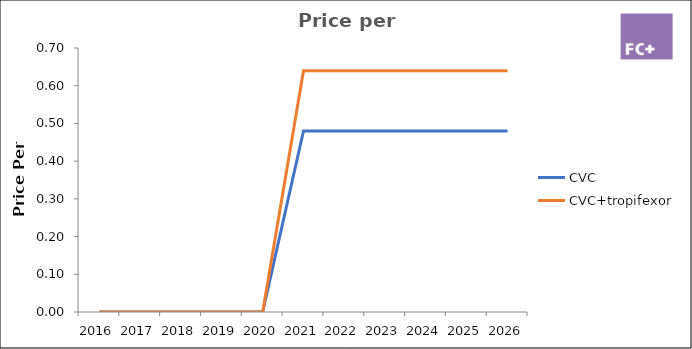
| Category | CVC | CVC+tropifexor |
|---|---|---|
| 2016.0 | 0 | 0 |
| 2017.0 | 0 | 0 |
| 2018.0 | 0 | 0 |
| 2019.0 | 0 | 0 |
| 2020.0 | 0 | 0 |
| 2021.0 | 0.48 | 0.64 |
| 2022.0 | 0.48 | 0.64 |
| 2023.0 | 0.48 | 0.64 |
| 2024.0 | 0.48 | 0.64 |
| 2025.0 | 0.48 | 0.64 |
| 2026.0 | 0.48 | 0.64 |